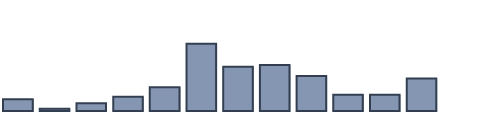
| Category | Series 0 |
|---|---|
| 0 | 3.693 |
| 1 | 0.728 |
| 2 | 2.483 |
| 3 | 4.481 |
| 4 | 7.454 |
| 5 | 21.196 |
| 6 | 13.948 |
| 7 | 14.494 |
| 8 | 11.053 |
| 9 | 5.129 |
| 10 | 5.121 |
| 11 | 10.222 |
| 12 | 0 |